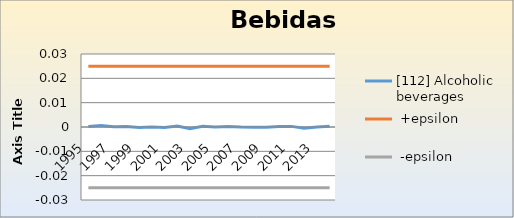
| Category | [112] Alcoholic beverages |  +epsilon |  -epsilon |
|---|---|---|---|
| 1995.0 | 0 | 0.025 | -0.025 |
| 1996.0 | 0.001 | 0.025 | -0.025 |
| 1997.0 | 0 | 0.025 | -0.025 |
| 1998.0 | 0 | 0.025 | -0.025 |
| 1999.0 | 0 | 0.025 | -0.025 |
| 2000.0 | 0 | 0.025 | -0.025 |
| 2001.0 | 0 | 0.025 | -0.025 |
| 2002.0 | 0 | 0.025 | -0.025 |
| 2003.0 | -0.001 | 0.025 | -0.025 |
| 2004.0 | 0 | 0.025 | -0.025 |
| 2005.0 | 0 | 0.025 | -0.025 |
| 2006.0 | 0 | 0.025 | -0.025 |
| 2007.0 | 0 | 0.025 | -0.025 |
| 2008.0 | 0 | 0.025 | -0.025 |
| 2009.0 | 0 | 0.025 | -0.025 |
| 2010.0 | 0 | 0.025 | -0.025 |
| 2011.0 | 0 | 0.025 | -0.025 |
| 2012.0 | -0.001 | 0.025 | -0.025 |
| 2013.0 | 0 | 0.025 | -0.025 |
| 2014.0 | 0 | 0.025 | -0.025 |